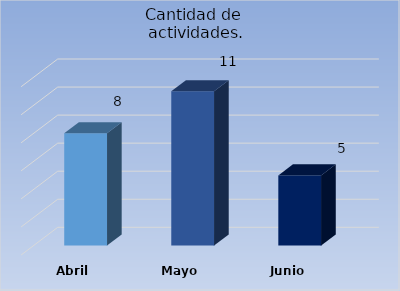
| Category | Cantidad de 
actividades. |
|---|---|
| Abril | 8 |
| Mayo | 11 |
| Junio | 5 |